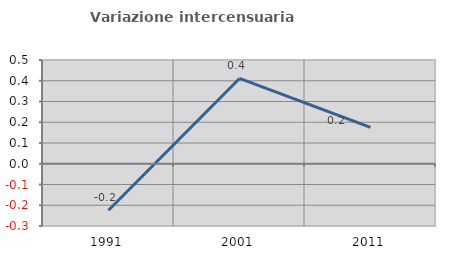
| Category | Variazione intercensuaria annua |
|---|---|
| 1991.0 | -0.224 |
| 2001.0 | 0.411 |
| 2011.0 | 0.176 |